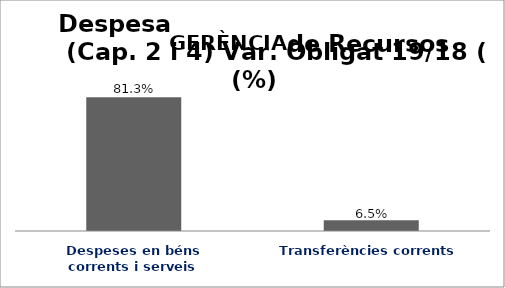
| Category | Series 0 |
|---|---|
| Despeses en béns corrents i serveis | 0.813 |
| Transferències corrents | 0.065 |